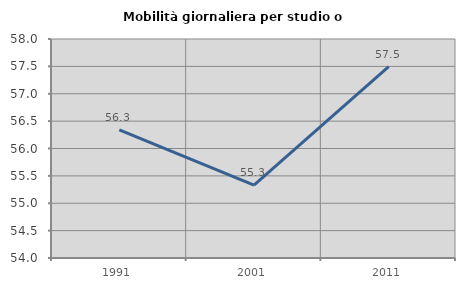
| Category | Mobilità giornaliera per studio o lavoro |
|---|---|
| 1991.0 | 56.338 |
| 2001.0 | 55.332 |
| 2011.0 | 57.496 |